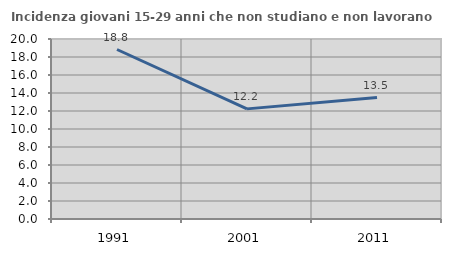
| Category | Incidenza giovani 15-29 anni che non studiano e non lavorano  |
|---|---|
| 1991.0 | 18.833 |
| 2001.0 | 12.236 |
| 2011.0 | 13.497 |